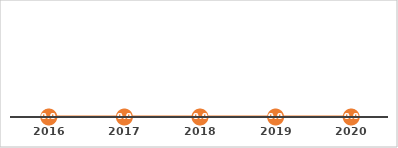
| Category | TASA DE EGRESO (%) |
|---|---|
| 2016.0 | 0 |
| 2017.0 | 0 |
| 2018.0 | 0 |
| 2019.0 | 0 |
| 2020.0 | 0 |